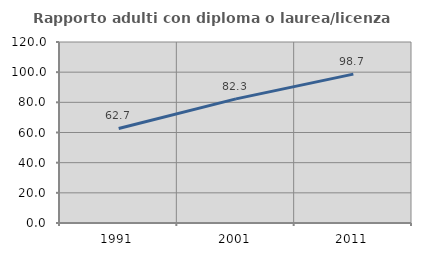
| Category | Rapporto adulti con diploma o laurea/licenza media  |
|---|---|
| 1991.0 | 62.7 |
| 2001.0 | 82.307 |
| 2011.0 | 98.701 |